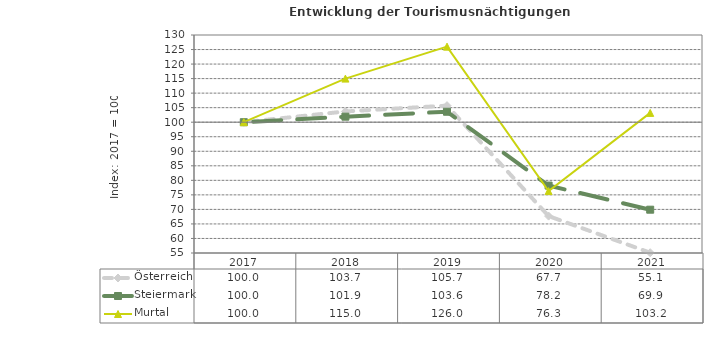
| Category | Österreich | Steiermark | Murtal |
|---|---|---|---|
| 2021.0 | 55.1 | 69.9 | 103.2 |
| 2020.0 | 67.7 | 78.2 | 76.3 |
| 2019.0 | 105.7 | 103.6 | 126 |
| 2018.0 | 103.7 | 101.9 | 115 |
| 2017.0 | 100 | 100 | 100 |